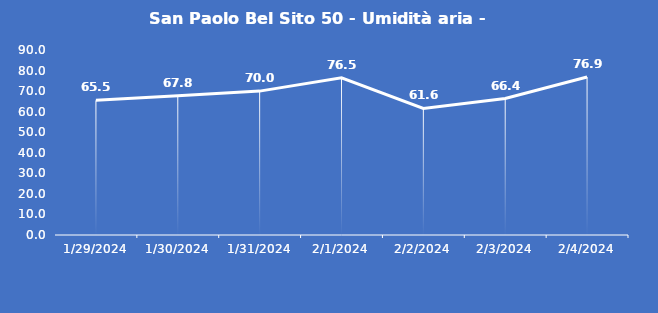
| Category | San Paolo Bel Sito 50 - Umidità aria - Grezzo (%) |
|---|---|
| 1/29/24 | 65.5 |
| 1/30/24 | 67.8 |
| 1/31/24 | 70 |
| 2/1/24 | 76.5 |
| 2/2/24 | 61.6 |
| 2/3/24 | 66.4 |
| 2/4/24 | 76.9 |